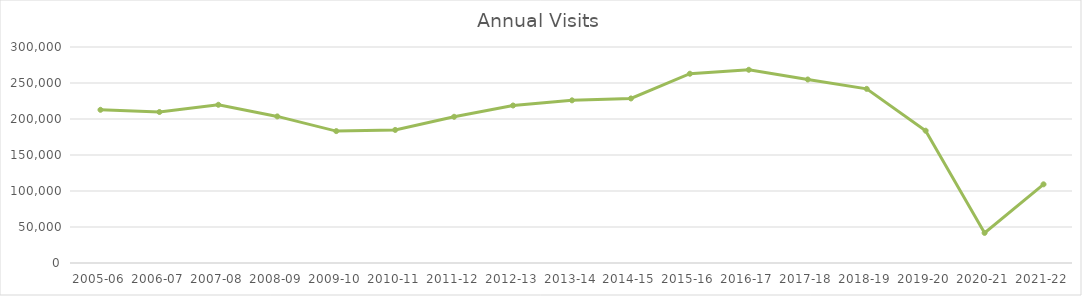
| Category | Series 0 |
|---|---|
| 2005-06 | 212770 |
| 2006-07 | 209725 |
| 2007-08 | 219750 |
| 2008-09 | 203589 |
| 2009-10 | 183186 |
| 2010-11 | 184812 |
| 2011-12 | 203074 |
| 2012-13 | 218745 |
| 2013-14 | 225912 |
| 2014-15 | 228538 |
| 2015-16 | 262865 |
| 2016-17 | 268347 |
| 2017-18 | 254873 |
| 2018-19 | 241853 |
| 2019-20 | 183752 |
| 2020-21 | 41816 |
| 2021-22 | 109287 |